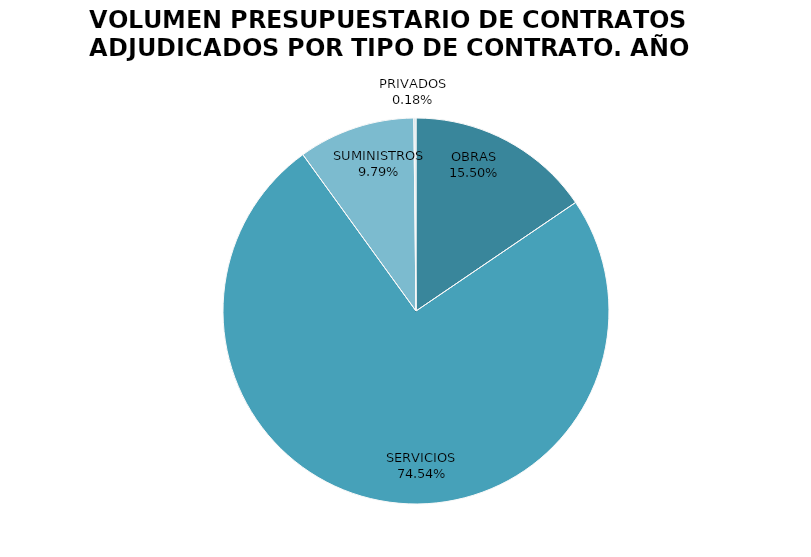
| Category | VOLUMEN PRESUPUESTARIO DE CONTRATOS ADJUDICADOS POR                           TIPO DE CONTRATO. AÑO 2020 VALOR | VOLUMEN PRESUPUESTARIO DE CONTRATOS ADJUDICADOS POR                           TIPO DE CONTRATO. AÑO 2020 % |
|---|---|---|
| OBRAS | 6278774.31 | 15.495 |
| SERVICIOS | 30202210.01 | 74.536 |
| SUMINISTROS | 3966857.06 | 9.79 |
| PRIVADOS | 72440.76 | 0.179 |